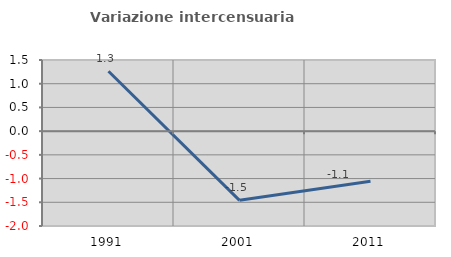
| Category | Variazione intercensuaria annua |
|---|---|
| 1991.0 | 1.264 |
| 2001.0 | -1.459 |
| 2011.0 | -1.056 |